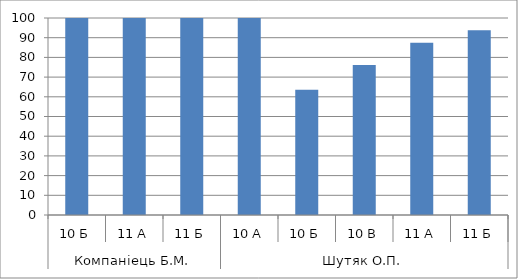
| Category | Series 0 |
|---|---|
| 0 | 100 |
| 1 | 100 |
| 2 | 100 |
| 3 | 100 |
| 4 | 63.636 |
| 5 | 76.19 |
| 6 | 87.5 |
| 7 | 93.75 |